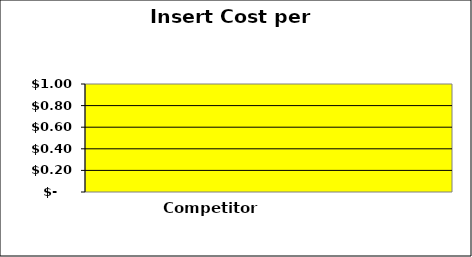
| Category | Competitor | Toshiba | Series 2 |
|---|---|---|---|
| 0 | 0 |  | 0 |